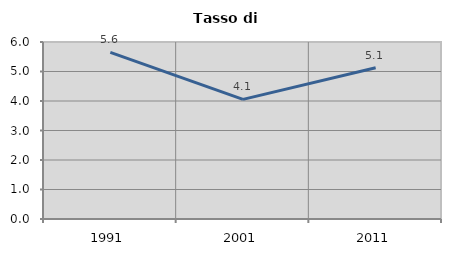
| Category | Tasso di disoccupazione   |
|---|---|
| 1991.0 | 5.646 |
| 2001.0 | 4.054 |
| 2011.0 | 5.127 |